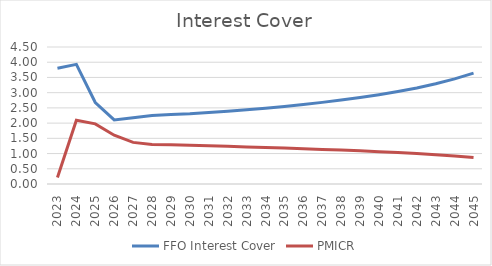
| Category | FFO Interest Cover | PMICR |
|---|---|---|
| 2023.0 | 3.805 | 0.212 |
| 2024.0 | 3.929 | 2.092 |
| 2025.0 | 2.677 | 1.976 |
| 2026.0 | 2.105 | 1.603 |
| 2027.0 | 2.179 | 1.367 |
| 2028.0 | 2.251 | 1.301 |
| 2029.0 | 2.282 | 1.29 |
| 2030.0 | 2.307 | 1.274 |
| 2031.0 | 2.349 | 1.255 |
| 2032.0 | 2.393 | 1.237 |
| 2033.0 | 2.44 | 1.218 |
| 2034.0 | 2.492 | 1.199 |
| 2035.0 | 2.549 | 1.179 |
| 2036.0 | 2.612 | 1.158 |
| 2037.0 | 2.681 | 1.136 |
| 2038.0 | 2.756 | 1.113 |
| 2039.0 | 2.839 | 1.089 |
| 2040.0 | 2.931 | 1.062 |
| 2041.0 | 3.036 | 1.032 |
| 2042.0 | 3.156 | 0.999 |
| 2043.0 | 3.294 | 0.961 |
| 2044.0 | 3.455 | 0.918 |
| 2045.0 | 3.642 | 0.869 |